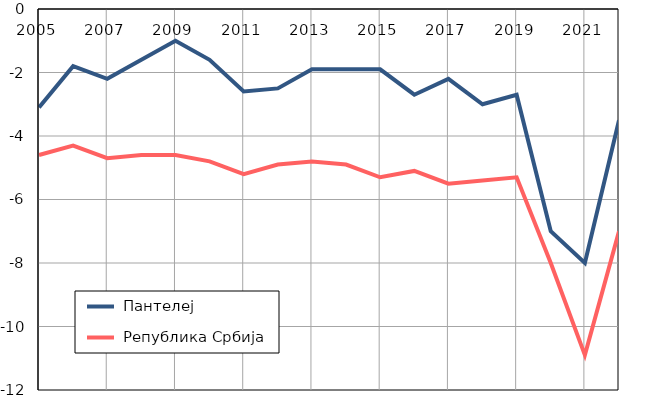
| Category |  Пантелеј |  Република Србија |
|---|---|---|
| 2005.0 | -3.1 | -4.6 |
| 2006.0 | -1.8 | -4.3 |
| 2007.0 | -2.2 | -4.7 |
| 2008.0 | -1.6 | -4.6 |
| 2009.0 | -1 | -4.6 |
| 2010.0 | -1.6 | -4.8 |
| 2011.0 | -2.6 | -5.2 |
| 2012.0 | -2.5 | -4.9 |
| 2013.0 | -1.9 | -4.8 |
| 2014.0 | -1.9 | -4.9 |
| 2015.0 | -1.9 | -5.3 |
| 2016.0 | -2.7 | -5.1 |
| 2017.0 | -2.2 | -5.5 |
| 2018.0 | -3 | -5.4 |
| 2019.0 | -2.7 | -5.3 |
| 2020.0 | -7 | -8 |
| 2021.0 | -8 | -10.9 |
| 2022.0 | -3.5 | -7 |